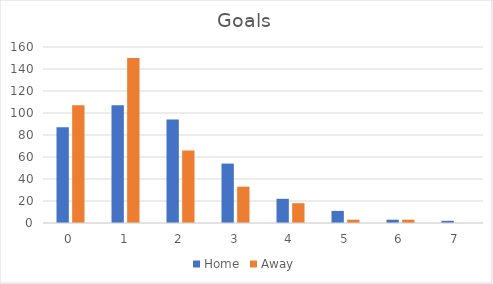
| Category | Home | Away |
|---|---|---|
| 0.0 | 87 | 107 |
| 1.0 | 107 | 150 |
| 2.0 | 94 | 66 |
| 3.0 | 54 | 33 |
| 4.0 | 22 | 18 |
| 5.0 | 11 | 3 |
| 6.0 | 3 | 3 |
| 7.0 | 2 | 0 |